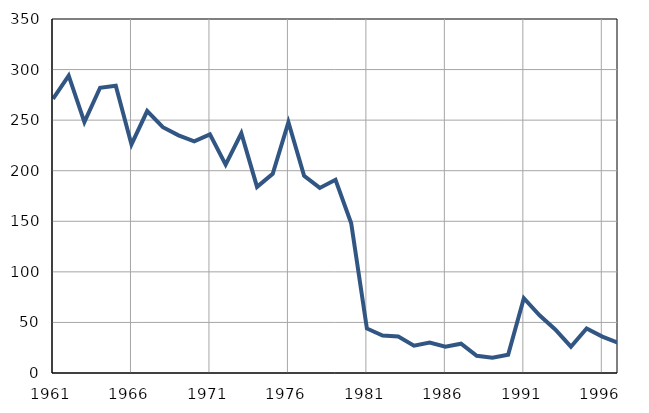
| Category | Infants
deaths |
|---|---|
| 1961.0 | 271 |
| 1962.0 | 294 |
| 1963.0 | 248 |
| 1964.0 | 282 |
| 1965.0 | 284 |
| 1966.0 | 226 |
| 1967.0 | 259 |
| 1968.0 | 243 |
| 1969.0 | 235 |
| 1970.0 | 229 |
| 1971.0 | 236 |
| 1972.0 | 206 |
| 1973.0 | 237 |
| 1974.0 | 184 |
| 1975.0 | 197 |
| 1976.0 | 248 |
| 1977.0 | 195 |
| 1978.0 | 183 |
| 1979.0 | 191 |
| 1980.0 | 148 |
| 1981.0 | 44 |
| 1982.0 | 37 |
| 1983.0 | 36 |
| 1984.0 | 27 |
| 1985.0 | 30 |
| 1986.0 | 26 |
| 1987.0 | 29 |
| 1988.0 | 17 |
| 1989.0 | 15 |
| 1990.0 | 18 |
| 1991.0 | 74 |
| 1992.0 | 57 |
| 1993.0 | 43 |
| 1994.0 | 26 |
| 1995.0 | 44 |
| 1996.0 | 36 |
| 1997.0 | 30 |